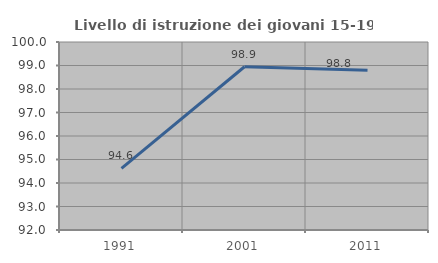
| Category | Livello di istruzione dei giovani 15-19 anni |
|---|---|
| 1991.0 | 94.624 |
| 2001.0 | 98.947 |
| 2011.0 | 98.795 |